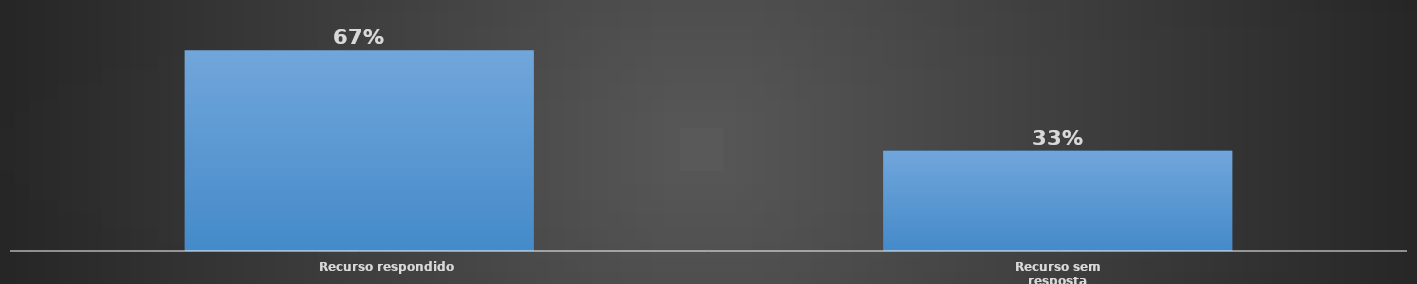
| Category | Total |
|---|---|
| Recurso respondido | 0.667 |
| Recurso sem resposta | 0.333 |